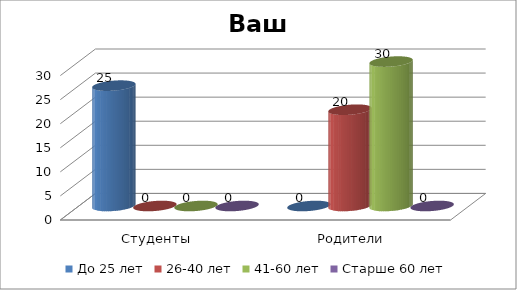
| Category | До 25 лет | 26-40 лет | 41-60 лет | Старше 60 лет |
|---|---|---|---|---|
| Студенты | 25 | 0 | 0 | 0 |
| Родители | 0 | 20 | 30 | 0 |